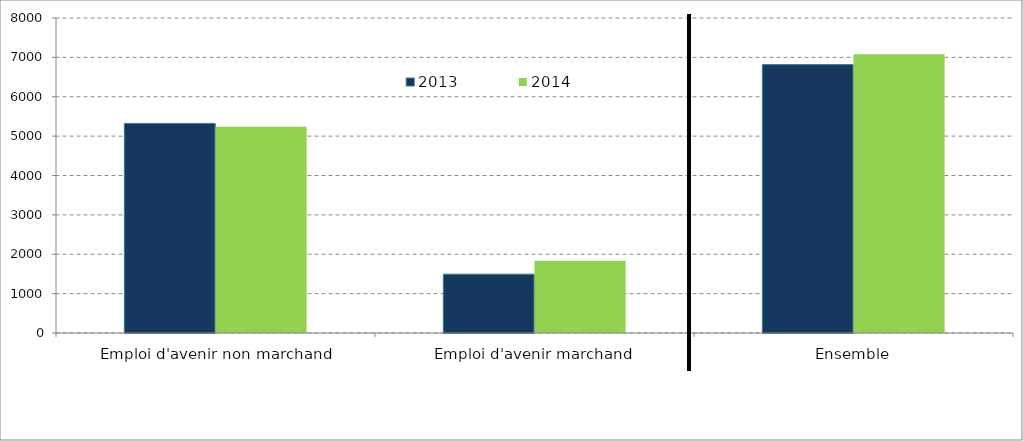
| Category | 2013 | 2014 |
|---|---|---|
| Emploi d'avenir non marchand | 5323 | 5241 |
| Emploi d'avenir marchand | 1493 | 1836 |
| Ensemble | 6816 | 7077 |